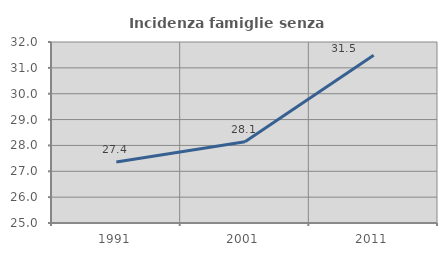
| Category | Incidenza famiglie senza nuclei |
|---|---|
| 1991.0 | 27.357 |
| 2001.0 | 28.144 |
| 2011.0 | 31.486 |